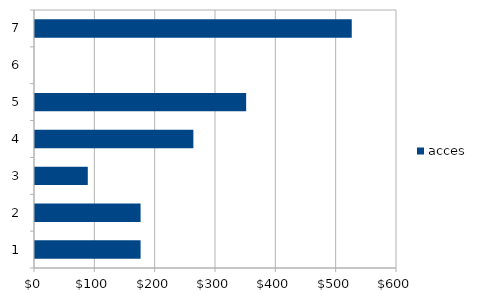
| Category | acces |
|---|---|
| 0 | 175 |
| 1 | 175 |
| 2 | 87.5 |
| 3 | 262.5 |
| 4 | 350 |
| 5 | 0 |
| 6 | 525 |